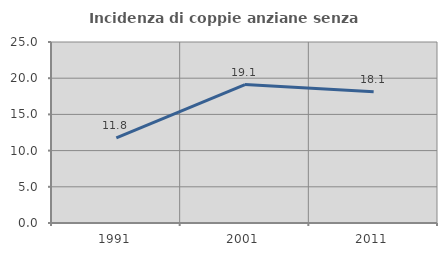
| Category | Incidenza di coppie anziane senza figli  |
|---|---|
| 1991.0 | 11.751 |
| 2001.0 | 19.118 |
| 2011.0 | 18.117 |